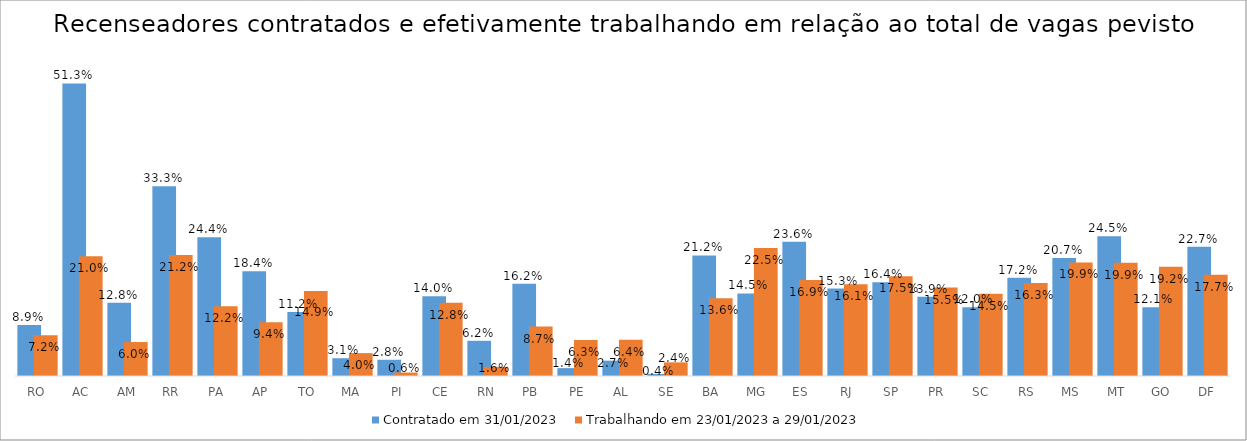
| Category | Contratado em 31/01/2023 | Trabalhando em 23/01/2023 a 29/01/2023 |
|---|---|---|
| RO | 0.089 | 0.072 |
| AC | 0.513 | 0.21 |
| AM | 0.128 | 0.06 |
| RR | 0.333 | 0.212 |
| PA | 0.244 | 0.122 |
| AP | 0.184 | 0.094 |
| TO | 0.112 | 0.149 |
| MA | 0.031 | 0.04 |
| PI | 0.028 | 0.006 |
| CE | 0.14 | 0.128 |
| RN | 0.062 | 0.016 |
| PB | 0.162 | 0.087 |
| PE | 0.014 | 0.063 |
| AL | 0.027 | 0.064 |
| SE | 0.004 | 0.024 |
| BA | 0.212 | 0.136 |
| MG | 0.145 | 0.225 |
| ES | 0.236 | 0.169 |
| RJ | 0.153 | 0.161 |
| SP | 0.164 | 0.175 |
| PR | 0.139 | 0.155 |
| SC | 0.12 | 0.145 |
| RS | 0.172 | 0.163 |
| MS | 0.207 | 0.199 |
| MT | 0.245 | 0.199 |
| GO | 0.121 | 0.192 |
| DF | 0.227 | 0.177 |